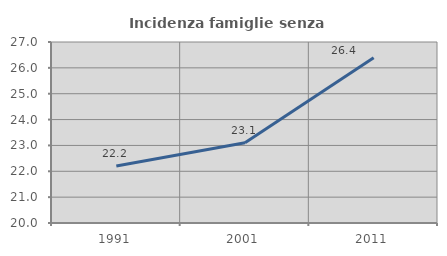
| Category | Incidenza famiglie senza nuclei |
|---|---|
| 1991.0 | 22.205 |
| 2001.0 | 23.102 |
| 2011.0 | 26.393 |